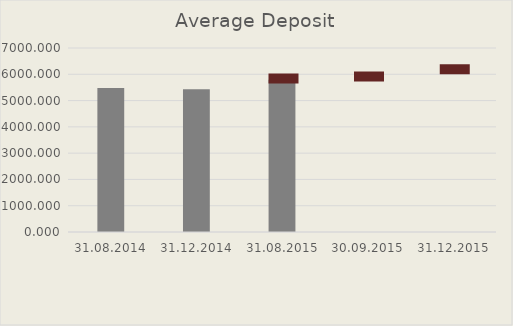
| Category | Average Deposit |
|---|---|
| 31.08.2014 | 5482.24 |
| 31.12.2014 | 5433.827 |
| 31.08.2015 | 5791.833 |
| 30.09.2015 | 0 |
| 31.12.2015 | 0 |